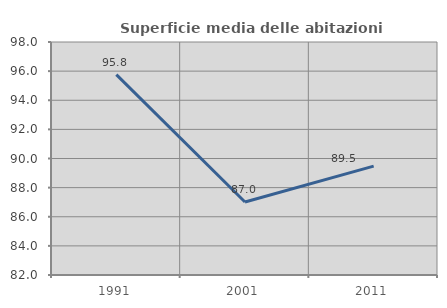
| Category | Superficie media delle abitazioni occupate |
|---|---|
| 1991.0 | 95.762 |
| 2001.0 | 87.009 |
| 2011.0 | 89.477 |